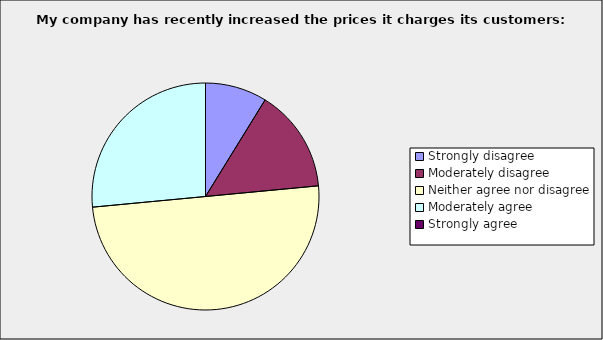
| Category | Series 0 |
|---|---|
| Strongly disagree | 0.088 |
| Moderately disagree | 0.147 |
| Neither agree nor disagree | 0.5 |
| Moderately agree | 0.265 |
| Strongly agree | 0 |